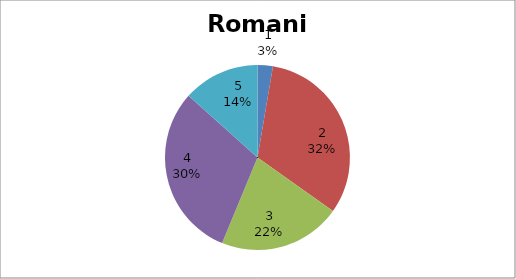
| Category | Romania |
|---|---|
| 0 | 3 |
| 1 | 36 |
| 2 | 24 |
| 3 | 34 |
| 4 | 15 |